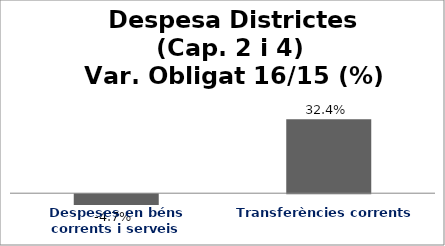
| Category | Series 0 |
|---|---|
| Despeses en béns corrents i serveis | -0.047 |
| Transferències corrents | 0.324 |